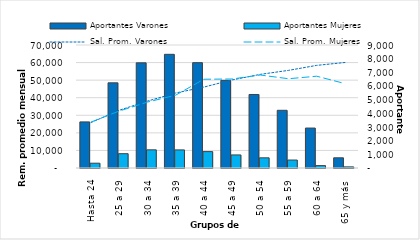
| Category | Aportantes Varones | Aportantes Mujeres |
|---|---|---|
| 0 | 3372 | 351 |
| 1 | 6231 | 1047 |
| 2 | 7695 | 1329 |
| 3 | 8318 | 1323 |
| 4 | 7708 | 1200 |
| 5 | 6413 | 956 |
| 6 | 5380 | 745 |
| 7 | 4222 | 583 |
| 8 | 2923 | 175 |
| 9 | 746 | 82 |